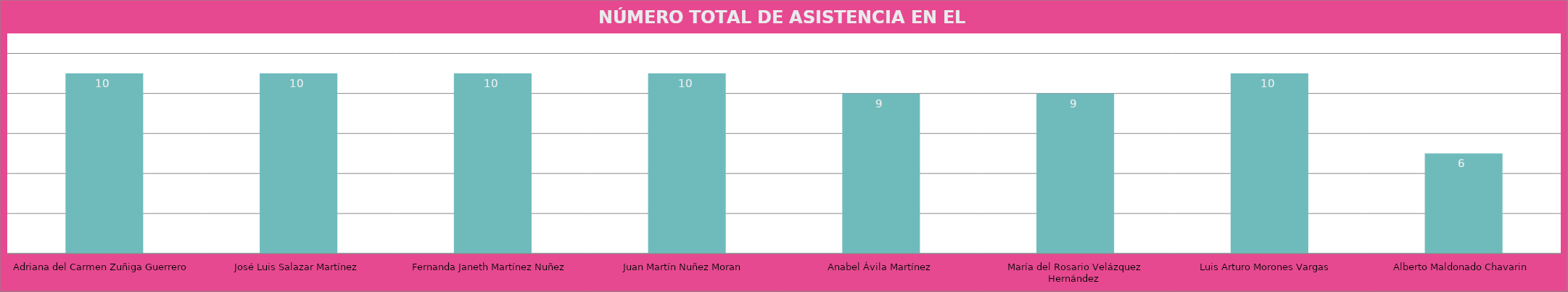
| Category | Adriana del Carmen Zuñiga Guerrero José Luis Salazar Martínez Fernanda Janeth Martínez Nuñez Juan Martín Nuñez Moran  Anabel Ávila Martínez María del Rosario Velázquez Hernández  Luis Arturo Morones Vargas  Alberto Maldonado Chavarin |
|---|---|
| Adriana del Carmen Zuñiga Guerrero | 10 |
| José Luis Salazar Martínez | 10 |
| Fernanda Janeth Martínez Nuñez | 10 |
| Juan Martín Nuñez Moran  | 10 |
| Anabel Ávila Martínez | 9 |
| María del Rosario Velázquez Hernández  | 9 |
| Luis Arturo Morones Vargas  | 10 |
| Alberto Maldonado Chavarin | 6 |